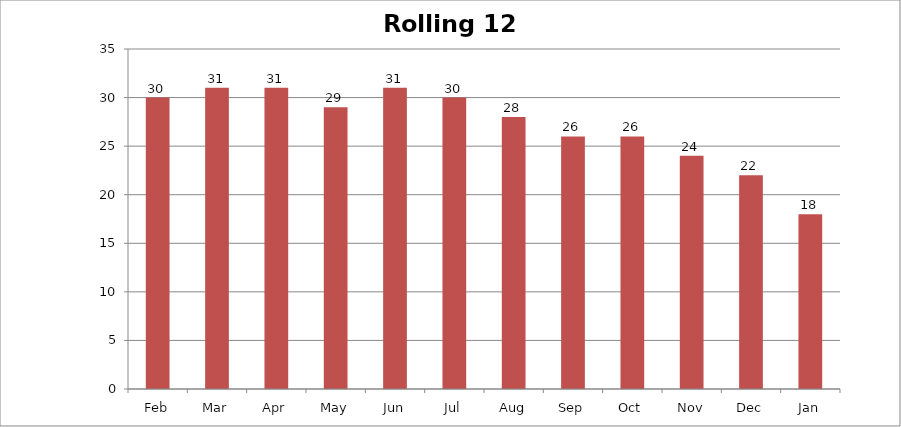
| Category | Rolling 12 Month |
|---|---|
| Feb | 30 |
| Mar | 31 |
| Apr | 31 |
| May | 29 |
| Jun | 31 |
| Jul | 30 |
| Aug | 28 |
| Sep | 26 |
| Oct | 26 |
| Nov | 24 |
| Dec | 22 |
| Jan | 18 |